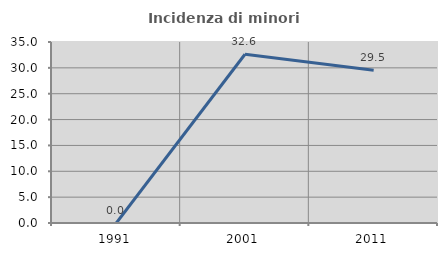
| Category | Incidenza di minori stranieri |
|---|---|
| 1991.0 | 0 |
| 2001.0 | 32.627 |
| 2011.0 | 29.517 |